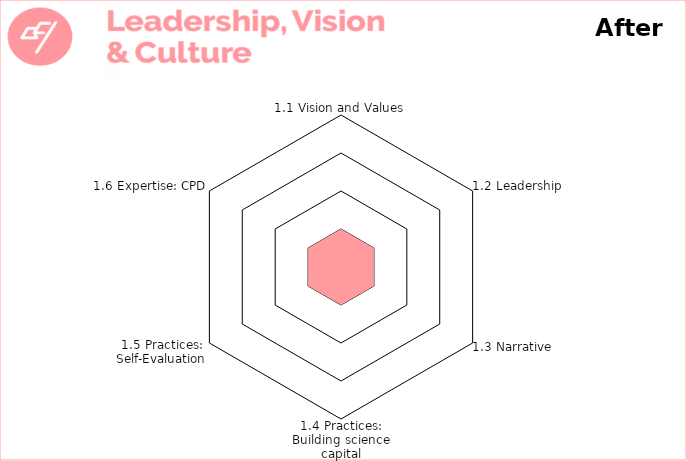
| Category | Theme 1: Leadership, Vision & Culture 

After |
|---|---|
| 1.1 Vision and Values | 1 |
| 1.2 Leadership | 1 |
| 1.3 Narrative | 1 |
| 1.4 Practices: Building science capital | 1 |
| 1.5 Practices: Self-Evaluation | 1 |
| 1.6 Expertise: CPD | 1 |